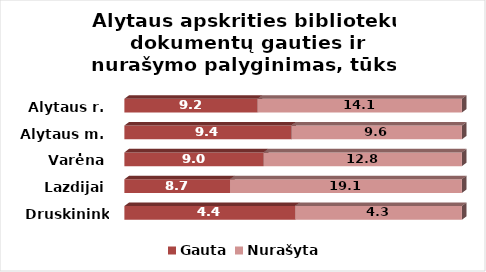
| Category | Gauta | Nurašyta |
|---|---|---|
| Druskininkai | 4.4 | 4.3 |
| Lazdijai | 8.7 | 19.1 |
| Varėna | 9 | 12.8 |
| Alytaus m. | 9.4 | 9.6 |
| Alytaus r. | 9.2 | 14.1 |